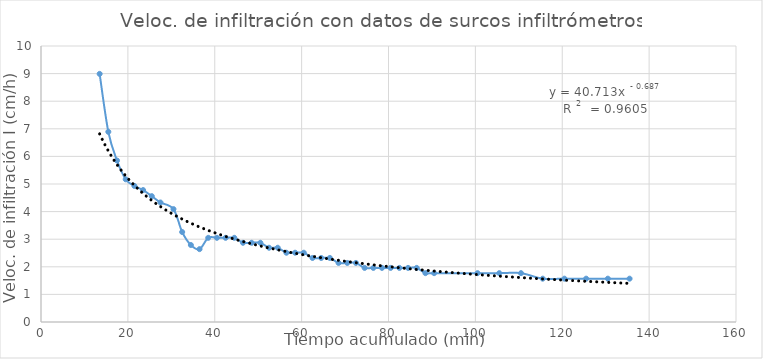
| Category | Series 0 |
|---|---|
| 13.5 | 8.99 |
| 15.5 | 6.89 |
| 17.5 | 5.85 |
| 19.5 | 5.17 |
| 21.5 | 4.93 |
| 23.5 | 4.78 |
| 25.5 | 4.56 |
| 27.5 | 4.33 |
| 30.5 | 4.09 |
| 32.5 | 3.26 |
| 34.5 | 2.79 |
| 36.5 | 2.64 |
| 38.5 | 3.05 |
| 40.5 | 3.05 |
| 42.5 | 3.05 |
| 44.5 | 3.05 |
| 46.5 | 2.87 |
| 48.5 | 2.87 |
| 50.5 | 2.87 |
| 52.5 | 2.69 |
| 54.5 | 2.69 |
| 56.5 | 2.51 |
| 58.5 | 2.51 |
| 60.5 | 2.51 |
| 62.5 | 2.32 |
| 64.5 | 2.32 |
| 66.5 | 2.32 |
| 68.5 | 2.14 |
| 70.5 | 2.14 |
| 72.5 | 2.14 |
| 74.5 | 1.96 |
| 76.5 | 1.96 |
| 78.5 | 1.96 |
| 80.5 | 1.96 |
| 82.5 | 1.96 |
| 84.5 | 1.96 |
| 86.5 | 1.96 |
| 88.5 | 1.77 |
| 90.5 | 1.77 |
| 100.5 | 1.77 |
| 105.5 | 1.77 |
| 110.5 | 1.77 |
| 115.5 | 1.57 |
| 120.5 | 1.57 |
| 125.5 | 1.57 |
| 130.5 | 1.57 |
| 135.5 | 1.57 |